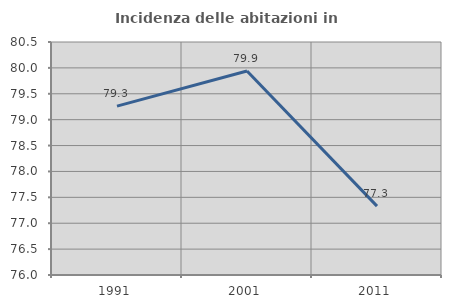
| Category | Incidenza delle abitazioni in proprietà  |
|---|---|
| 1991.0 | 79.262 |
| 2001.0 | 79.939 |
| 2011.0 | 77.33 |